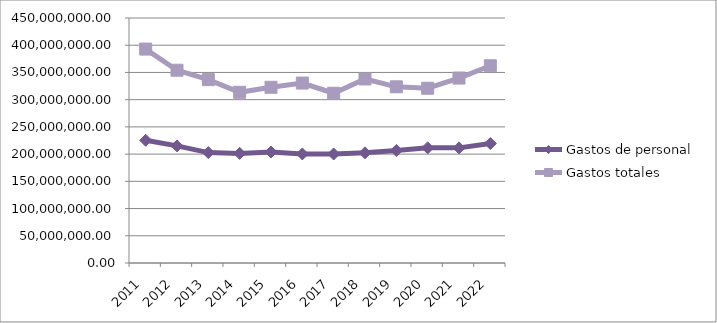
| Category | Gastos de personal  | Gastos totales  |
|---|---|---|
| 2011 | 225391661.23 | 392907659.76 |
| 2012 | 215110369.31 | 354075378.3 |
| 2013 | 202787311.75 | 336783248.85 |
| 2014 | 201334556.05 | 313515763.33 |
| 2015 | 203930851.7 | 322731968.98 |
| 2016 | 200290475.98 | 330516726.43 |
| 2017 | 200188206.65 | 311782620.51 |
| 2018 | 202306908.52 | 338024022.46 |
| 2019 | 206608399.12 | 323589090.94 |
| 2020 | 211476358.46 | 320978742.58 |
| 2021 | 211455452.82 | 339696892.63 |
| 2022 | 219422784.09 | 362271625.79 |